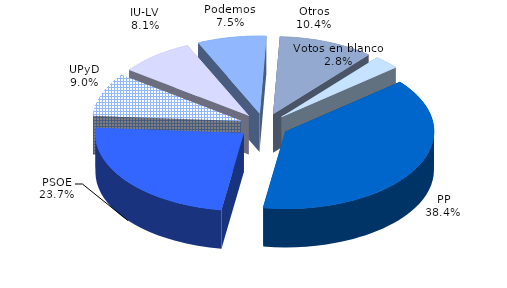
| Category | Series 0 |
|---|---|
| Votos en blanco | 3263 |
| PP | 44093 |
| PSOE | 27166 |
| UPyD | 10321 |
| IU-LV | 9324 |
| Podemos | 8598 |
| Otros | 11916 |